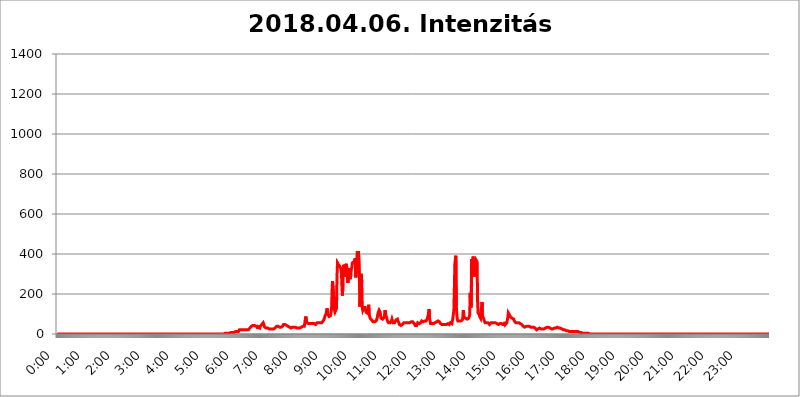
| Category | 2018.04.06. Intenzitás [W/m^2] |
|---|---|
| 0.0 | 0 |
| 0.0006944444444444445 | 0 |
| 0.001388888888888889 | 0 |
| 0.0020833333333333333 | 0 |
| 0.002777777777777778 | 0 |
| 0.003472222222222222 | 0 |
| 0.004166666666666667 | 0 |
| 0.004861111111111111 | 0 |
| 0.005555555555555556 | 0 |
| 0.0062499999999999995 | 0 |
| 0.006944444444444444 | 0 |
| 0.007638888888888889 | 0 |
| 0.008333333333333333 | 0 |
| 0.009027777777777779 | 0 |
| 0.009722222222222222 | 0 |
| 0.010416666666666666 | 0 |
| 0.011111111111111112 | 0 |
| 0.011805555555555555 | 0 |
| 0.012499999999999999 | 0 |
| 0.013194444444444444 | 0 |
| 0.013888888888888888 | 0 |
| 0.014583333333333332 | 0 |
| 0.015277777777777777 | 0 |
| 0.015972222222222224 | 0 |
| 0.016666666666666666 | 0 |
| 0.017361111111111112 | 0 |
| 0.018055555555555557 | 0 |
| 0.01875 | 0 |
| 0.019444444444444445 | 0 |
| 0.02013888888888889 | 0 |
| 0.020833333333333332 | 0 |
| 0.02152777777777778 | 0 |
| 0.022222222222222223 | 0 |
| 0.02291666666666667 | 0 |
| 0.02361111111111111 | 0 |
| 0.024305555555555556 | 0 |
| 0.024999999999999998 | 0 |
| 0.025694444444444447 | 0 |
| 0.02638888888888889 | 0 |
| 0.027083333333333334 | 0 |
| 0.027777777777777776 | 0 |
| 0.02847222222222222 | 0 |
| 0.029166666666666664 | 0 |
| 0.029861111111111113 | 0 |
| 0.030555555555555555 | 0 |
| 0.03125 | 0 |
| 0.03194444444444445 | 0 |
| 0.03263888888888889 | 0 |
| 0.03333333333333333 | 0 |
| 0.034027777777777775 | 0 |
| 0.034722222222222224 | 0 |
| 0.035416666666666666 | 0 |
| 0.036111111111111115 | 0 |
| 0.03680555555555556 | 0 |
| 0.0375 | 0 |
| 0.03819444444444444 | 0 |
| 0.03888888888888889 | 0 |
| 0.03958333333333333 | 0 |
| 0.04027777777777778 | 0 |
| 0.04097222222222222 | 0 |
| 0.041666666666666664 | 0 |
| 0.042361111111111106 | 0 |
| 0.04305555555555556 | 0 |
| 0.043750000000000004 | 0 |
| 0.044444444444444446 | 0 |
| 0.04513888888888889 | 0 |
| 0.04583333333333334 | 0 |
| 0.04652777777777778 | 0 |
| 0.04722222222222222 | 0 |
| 0.04791666666666666 | 0 |
| 0.04861111111111111 | 0 |
| 0.049305555555555554 | 0 |
| 0.049999999999999996 | 0 |
| 0.05069444444444445 | 0 |
| 0.051388888888888894 | 0 |
| 0.052083333333333336 | 0 |
| 0.05277777777777778 | 0 |
| 0.05347222222222222 | 0 |
| 0.05416666666666667 | 0 |
| 0.05486111111111111 | 0 |
| 0.05555555555555555 | 0 |
| 0.05625 | 0 |
| 0.05694444444444444 | 0 |
| 0.057638888888888885 | 0 |
| 0.05833333333333333 | 0 |
| 0.05902777777777778 | 0 |
| 0.059722222222222225 | 0 |
| 0.06041666666666667 | 0 |
| 0.061111111111111116 | 0 |
| 0.06180555555555556 | 0 |
| 0.0625 | 0 |
| 0.06319444444444444 | 0 |
| 0.06388888888888888 | 0 |
| 0.06458333333333334 | 0 |
| 0.06527777777777778 | 0 |
| 0.06597222222222222 | 0 |
| 0.06666666666666667 | 0 |
| 0.06736111111111111 | 0 |
| 0.06805555555555555 | 0 |
| 0.06874999999999999 | 0 |
| 0.06944444444444443 | 0 |
| 0.07013888888888889 | 0 |
| 0.07083333333333333 | 0 |
| 0.07152777777777779 | 0 |
| 0.07222222222222223 | 0 |
| 0.07291666666666667 | 0 |
| 0.07361111111111111 | 0 |
| 0.07430555555555556 | 0 |
| 0.075 | 0 |
| 0.07569444444444444 | 0 |
| 0.0763888888888889 | 0 |
| 0.07708333333333334 | 0 |
| 0.07777777777777778 | 0 |
| 0.07847222222222222 | 0 |
| 0.07916666666666666 | 0 |
| 0.0798611111111111 | 0 |
| 0.08055555555555556 | 0 |
| 0.08125 | 0 |
| 0.08194444444444444 | 0 |
| 0.08263888888888889 | 0 |
| 0.08333333333333333 | 0 |
| 0.08402777777777777 | 0 |
| 0.08472222222222221 | 0 |
| 0.08541666666666665 | 0 |
| 0.08611111111111112 | 0 |
| 0.08680555555555557 | 0 |
| 0.08750000000000001 | 0 |
| 0.08819444444444445 | 0 |
| 0.08888888888888889 | 0 |
| 0.08958333333333333 | 0 |
| 0.09027777777777778 | 0 |
| 0.09097222222222222 | 0 |
| 0.09166666666666667 | 0 |
| 0.09236111111111112 | 0 |
| 0.09305555555555556 | 0 |
| 0.09375 | 0 |
| 0.09444444444444444 | 0 |
| 0.09513888888888888 | 0 |
| 0.09583333333333333 | 0 |
| 0.09652777777777777 | 0 |
| 0.09722222222222222 | 0 |
| 0.09791666666666667 | 0 |
| 0.09861111111111111 | 0 |
| 0.09930555555555555 | 0 |
| 0.09999999999999999 | 0 |
| 0.10069444444444443 | 0 |
| 0.1013888888888889 | 0 |
| 0.10208333333333335 | 0 |
| 0.10277777777777779 | 0 |
| 0.10347222222222223 | 0 |
| 0.10416666666666667 | 0 |
| 0.10486111111111111 | 0 |
| 0.10555555555555556 | 0 |
| 0.10625 | 0 |
| 0.10694444444444444 | 0 |
| 0.1076388888888889 | 0 |
| 0.10833333333333334 | 0 |
| 0.10902777777777778 | 0 |
| 0.10972222222222222 | 0 |
| 0.1111111111111111 | 0 |
| 0.11180555555555556 | 0 |
| 0.11180555555555556 | 0 |
| 0.1125 | 0 |
| 0.11319444444444444 | 0 |
| 0.11388888888888889 | 0 |
| 0.11458333333333333 | 0 |
| 0.11527777777777777 | 0 |
| 0.11597222222222221 | 0 |
| 0.11666666666666665 | 0 |
| 0.1173611111111111 | 0 |
| 0.11805555555555557 | 0 |
| 0.11944444444444445 | 0 |
| 0.12013888888888889 | 0 |
| 0.12083333333333333 | 0 |
| 0.12152777777777778 | 0 |
| 0.12222222222222223 | 0 |
| 0.12291666666666667 | 0 |
| 0.12291666666666667 | 0 |
| 0.12361111111111112 | 0 |
| 0.12430555555555556 | 0 |
| 0.125 | 0 |
| 0.12569444444444444 | 0 |
| 0.12638888888888888 | 0 |
| 0.12708333333333333 | 0 |
| 0.16875 | 0 |
| 0.12847222222222224 | 0 |
| 0.12916666666666668 | 0 |
| 0.12986111111111112 | 0 |
| 0.13055555555555556 | 0 |
| 0.13125 | 0 |
| 0.13194444444444445 | 0 |
| 0.1326388888888889 | 0 |
| 0.13333333333333333 | 0 |
| 0.13402777777777777 | 0 |
| 0.13402777777777777 | 0 |
| 0.13472222222222222 | 0 |
| 0.13541666666666666 | 0 |
| 0.1361111111111111 | 0 |
| 0.13749999999999998 | 0 |
| 0.13819444444444443 | 0 |
| 0.1388888888888889 | 0 |
| 0.13958333333333334 | 0 |
| 0.14027777777777778 | 0 |
| 0.14097222222222222 | 0 |
| 0.14166666666666666 | 0 |
| 0.1423611111111111 | 0 |
| 0.14305555555555557 | 0 |
| 0.14375000000000002 | 0 |
| 0.14444444444444446 | 0 |
| 0.1451388888888889 | 0 |
| 0.1451388888888889 | 0 |
| 0.14652777777777778 | 0 |
| 0.14722222222222223 | 0 |
| 0.14791666666666667 | 0 |
| 0.1486111111111111 | 0 |
| 0.14930555555555555 | 0 |
| 0.15 | 0 |
| 0.15069444444444444 | 0 |
| 0.15138888888888888 | 0 |
| 0.15208333333333332 | 0 |
| 0.15277777777777776 | 0 |
| 0.15347222222222223 | 0 |
| 0.15416666666666667 | 0 |
| 0.15486111111111112 | 0 |
| 0.15555555555555556 | 0 |
| 0.15625 | 0 |
| 0.15694444444444444 | 0 |
| 0.15763888888888888 | 0 |
| 0.15833333333333333 | 0 |
| 0.15902777777777777 | 0 |
| 0.15972222222222224 | 0 |
| 0.16041666666666668 | 0 |
| 0.16111111111111112 | 0 |
| 0.16180555555555556 | 0 |
| 0.1625 | 0 |
| 0.16319444444444445 | 0 |
| 0.1638888888888889 | 0 |
| 0.16458333333333333 | 0 |
| 0.16527777777777777 | 0 |
| 0.16597222222222222 | 0 |
| 0.16666666666666666 | 0 |
| 0.1673611111111111 | 0 |
| 0.16805555555555554 | 0 |
| 0.16874999999999998 | 0 |
| 0.16944444444444443 | 0 |
| 0.17013888888888887 | 0 |
| 0.1708333333333333 | 0 |
| 0.17152777777777775 | 0 |
| 0.17222222222222225 | 0 |
| 0.1729166666666667 | 0 |
| 0.17361111111111113 | 0 |
| 0.17430555555555557 | 0 |
| 0.17500000000000002 | 0 |
| 0.17569444444444446 | 0 |
| 0.1763888888888889 | 0 |
| 0.17708333333333334 | 0 |
| 0.17777777777777778 | 0 |
| 0.17847222222222223 | 0 |
| 0.17916666666666667 | 0 |
| 0.1798611111111111 | 0 |
| 0.18055555555555555 | 0 |
| 0.18125 | 0 |
| 0.18194444444444444 | 0 |
| 0.1826388888888889 | 0 |
| 0.18333333333333335 | 0 |
| 0.1840277777777778 | 0 |
| 0.18472222222222223 | 0 |
| 0.18541666666666667 | 0 |
| 0.18611111111111112 | 0 |
| 0.18680555555555556 | 0 |
| 0.1875 | 0 |
| 0.18819444444444444 | 0 |
| 0.18888888888888888 | 0 |
| 0.18958333333333333 | 0 |
| 0.19027777777777777 | 0 |
| 0.1909722222222222 | 0 |
| 0.19166666666666665 | 0 |
| 0.19236111111111112 | 0 |
| 0.19305555555555554 | 0 |
| 0.19375 | 0 |
| 0.19444444444444445 | 0 |
| 0.1951388888888889 | 0 |
| 0.19583333333333333 | 0 |
| 0.19652777777777777 | 0 |
| 0.19722222222222222 | 0 |
| 0.19791666666666666 | 0 |
| 0.1986111111111111 | 0 |
| 0.19930555555555554 | 0 |
| 0.19999999999999998 | 0 |
| 0.20069444444444443 | 0 |
| 0.20138888888888887 | 0 |
| 0.2020833333333333 | 0 |
| 0.2027777777777778 | 0 |
| 0.2034722222222222 | 0 |
| 0.2041666666666667 | 0 |
| 0.20486111111111113 | 0 |
| 0.20555555555555557 | 0 |
| 0.20625000000000002 | 0 |
| 0.20694444444444446 | 0 |
| 0.2076388888888889 | 0 |
| 0.20833333333333334 | 0 |
| 0.20902777777777778 | 0 |
| 0.20972222222222223 | 0 |
| 0.21041666666666667 | 0 |
| 0.2111111111111111 | 0 |
| 0.21180555555555555 | 0 |
| 0.2125 | 0 |
| 0.21319444444444444 | 0 |
| 0.2138888888888889 | 0 |
| 0.21458333333333335 | 0 |
| 0.2152777777777778 | 0 |
| 0.21597222222222223 | 0 |
| 0.21666666666666667 | 0 |
| 0.21736111111111112 | 0 |
| 0.21805555555555556 | 0 |
| 0.21875 | 0 |
| 0.21944444444444444 | 0 |
| 0.22013888888888888 | 0 |
| 0.22083333333333333 | 0 |
| 0.22152777777777777 | 0 |
| 0.2222222222222222 | 0 |
| 0.22291666666666665 | 0 |
| 0.2236111111111111 | 0 |
| 0.22430555555555556 | 0 |
| 0.225 | 0 |
| 0.22569444444444445 | 0 |
| 0.2263888888888889 | 0 |
| 0.22708333333333333 | 0 |
| 0.22777777777777777 | 0 |
| 0.22847222222222222 | 0 |
| 0.22916666666666666 | 0 |
| 0.2298611111111111 | 0 |
| 0.23055555555555554 | 0 |
| 0.23124999999999998 | 0 |
| 0.23194444444444443 | 0 |
| 0.23263888888888887 | 3.525 |
| 0.2333333333333333 | 0 |
| 0.2340277777777778 | 3.525 |
| 0.2347222222222222 | 3.525 |
| 0.2354166666666667 | 3.525 |
| 0.23611111111111113 | 3.525 |
| 0.23680555555555557 | 3.525 |
| 0.23750000000000002 | 3.525 |
| 0.23819444444444446 | 3.525 |
| 0.2388888888888889 | 3.525 |
| 0.23958333333333334 | 3.525 |
| 0.24027777777777778 | 3.525 |
| 0.24097222222222223 | 3.525 |
| 0.24166666666666667 | 3.525 |
| 0.2423611111111111 | 3.525 |
| 0.24305555555555555 | 7.887 |
| 0.24375 | 7.887 |
| 0.24444444444444446 | 7.887 |
| 0.24513888888888888 | 7.887 |
| 0.24583333333333335 | 7.887 |
| 0.2465277777777778 | 7.887 |
| 0.24722222222222223 | 12.257 |
| 0.24791666666666667 | 7.887 |
| 0.24861111111111112 | 7.887 |
| 0.24930555555555556 | 7.887 |
| 0.25 | 12.257 |
| 0.25069444444444444 | 12.257 |
| 0.2513888888888889 | 12.257 |
| 0.2520833333333333 | 12.257 |
| 0.25277777777777777 | 12.257 |
| 0.2534722222222222 | 12.257 |
| 0.25416666666666665 | 12.257 |
| 0.2548611111111111 | 16.636 |
| 0.2555555555555556 | 21.024 |
| 0.25625000000000003 | 21.024 |
| 0.2569444444444445 | 21.024 |
| 0.2576388888888889 | 21.024 |
| 0.25833333333333336 | 21.024 |
| 0.2590277777777778 | 21.024 |
| 0.25972222222222224 | 21.024 |
| 0.2604166666666667 | 21.024 |
| 0.2611111111111111 | 21.024 |
| 0.26180555555555557 | 21.024 |
| 0.2625 | 21.024 |
| 0.26319444444444445 | 21.024 |
| 0.2638888888888889 | 21.024 |
| 0.26458333333333334 | 21.024 |
| 0.2652777777777778 | 16.636 |
| 0.2659722222222222 | 21.024 |
| 0.26666666666666666 | 21.024 |
| 0.2673611111111111 | 21.024 |
| 0.26805555555555555 | 21.024 |
| 0.26875 | 25.419 |
| 0.26944444444444443 | 25.419 |
| 0.2701388888888889 | 29.823 |
| 0.2708333333333333 | 29.823 |
| 0.27152777777777776 | 34.234 |
| 0.2722222222222222 | 38.653 |
| 0.27291666666666664 | 38.653 |
| 0.2736111111111111 | 38.653 |
| 0.2743055555555555 | 43.079 |
| 0.27499999999999997 | 38.653 |
| 0.27569444444444446 | 38.653 |
| 0.27638888888888885 | 43.079 |
| 0.27708333333333335 | 43.079 |
| 0.2777777777777778 | 43.079 |
| 0.27847222222222223 | 38.653 |
| 0.2791666666666667 | 38.653 |
| 0.2798611111111111 | 38.653 |
| 0.28055555555555556 | 38.653 |
| 0.28125 | 25.419 |
| 0.28194444444444444 | 34.234 |
| 0.2826388888888889 | 34.234 |
| 0.2833333333333333 | 29.823 |
| 0.28402777777777777 | 29.823 |
| 0.2847222222222222 | 38.653 |
| 0.28541666666666665 | 43.079 |
| 0.28611111111111115 | 43.079 |
| 0.28680555555555554 | 47.511 |
| 0.28750000000000003 | 51.951 |
| 0.2881944444444445 | 51.951 |
| 0.2888888888888889 | 56.398 |
| 0.28958333333333336 | 56.398 |
| 0.2902777777777778 | 56.398 |
| 0.29097222222222224 | 34.234 |
| 0.2916666666666667 | 29.823 |
| 0.2923611111111111 | 29.823 |
| 0.29305555555555557 | 29.823 |
| 0.29375 | 29.823 |
| 0.29444444444444445 | 29.823 |
| 0.2951388888888889 | 29.823 |
| 0.29583333333333334 | 25.419 |
| 0.2965277777777778 | 25.419 |
| 0.2972222222222222 | 25.419 |
| 0.29791666666666666 | 25.419 |
| 0.2986111111111111 | 25.419 |
| 0.29930555555555555 | 25.419 |
| 0.3 | 21.024 |
| 0.30069444444444443 | 21.024 |
| 0.3013888888888889 | 25.419 |
| 0.3020833333333333 | 25.419 |
| 0.30277777777777776 | 29.823 |
| 0.3034722222222222 | 25.419 |
| 0.30416666666666664 | 25.419 |
| 0.3048611111111111 | 29.823 |
| 0.3055555555555555 | 29.823 |
| 0.30624999999999997 | 34.234 |
| 0.3069444444444444 | 34.234 |
| 0.3076388888888889 | 38.653 |
| 0.30833333333333335 | 38.653 |
| 0.3090277777777778 | 38.653 |
| 0.30972222222222223 | 38.653 |
| 0.3104166666666667 | 38.653 |
| 0.3111111111111111 | 34.234 |
| 0.31180555555555556 | 34.234 |
| 0.3125 | 34.234 |
| 0.31319444444444444 | 34.234 |
| 0.3138888888888889 | 34.234 |
| 0.3145833333333333 | 34.234 |
| 0.31527777777777777 | 38.653 |
| 0.3159722222222222 | 38.653 |
| 0.31666666666666665 | 43.079 |
| 0.31736111111111115 | 47.511 |
| 0.31805555555555554 | 47.511 |
| 0.31875000000000003 | 47.511 |
| 0.3194444444444445 | 47.511 |
| 0.3201388888888889 | 47.511 |
| 0.32083333333333336 | 43.079 |
| 0.3215277777777778 | 43.079 |
| 0.32222222222222224 | 43.079 |
| 0.3229166666666667 | 38.653 |
| 0.3236111111111111 | 38.653 |
| 0.32430555555555557 | 38.653 |
| 0.325 | 38.653 |
| 0.32569444444444445 | 34.234 |
| 0.3263888888888889 | 34.234 |
| 0.32708333333333334 | 34.234 |
| 0.3277777777777778 | 29.823 |
| 0.3284722222222222 | 34.234 |
| 0.32916666666666666 | 29.823 |
| 0.3298611111111111 | 34.234 |
| 0.33055555555555555 | 34.234 |
| 0.33125 | 34.234 |
| 0.33194444444444443 | 34.234 |
| 0.3326388888888889 | 34.234 |
| 0.3333333333333333 | 34.234 |
| 0.3340277777777778 | 34.234 |
| 0.3347222222222222 | 34.234 |
| 0.3354166666666667 | 29.823 |
| 0.3361111111111111 | 29.823 |
| 0.3368055555555556 | 29.823 |
| 0.33749999999999997 | 29.823 |
| 0.33819444444444446 | 29.823 |
| 0.33888888888888885 | 29.823 |
| 0.33958333333333335 | 29.823 |
| 0.34027777777777773 | 29.823 |
| 0.34097222222222223 | 34.234 |
| 0.3416666666666666 | 34.234 |
| 0.3423611111111111 | 34.234 |
| 0.3430555555555555 | 34.234 |
| 0.34375 | 34.234 |
| 0.3444444444444445 | 38.653 |
| 0.3451388888888889 | 38.653 |
| 0.3458333333333334 | 38.653 |
| 0.34652777777777777 | 38.653 |
| 0.34722222222222227 | 43.079 |
| 0.34791666666666665 | 74.246 |
| 0.34861111111111115 | 87.692 |
| 0.34930555555555554 | 83.205 |
| 0.35000000000000003 | 56.398 |
| 0.3506944444444444 | 56.398 |
| 0.3513888888888889 | 51.951 |
| 0.3520833333333333 | 51.951 |
| 0.3527777777777778 | 51.951 |
| 0.3534722222222222 | 51.951 |
| 0.3541666666666667 | 51.951 |
| 0.3548611111111111 | 51.951 |
| 0.35555555555555557 | 51.951 |
| 0.35625 | 51.951 |
| 0.35694444444444445 | 56.398 |
| 0.3576388888888889 | 51.951 |
| 0.35833333333333334 | 51.951 |
| 0.3590277777777778 | 51.951 |
| 0.3597222222222222 | 51.951 |
| 0.36041666666666666 | 51.951 |
| 0.3611111111111111 | 47.511 |
| 0.36180555555555555 | 47.511 |
| 0.3625 | 47.511 |
| 0.36319444444444443 | 47.511 |
| 0.3638888888888889 | 51.951 |
| 0.3645833333333333 | 56.398 |
| 0.3652777777777778 | 56.398 |
| 0.3659722222222222 | 56.398 |
| 0.3666666666666667 | 56.398 |
| 0.3673611111111111 | 56.398 |
| 0.3680555555555556 | 56.398 |
| 0.36874999999999997 | 56.398 |
| 0.36944444444444446 | 56.398 |
| 0.37013888888888885 | 56.398 |
| 0.37083333333333335 | 56.398 |
| 0.37152777777777773 | 56.398 |
| 0.37222222222222223 | 60.85 |
| 0.3729166666666666 | 65.31 |
| 0.3736111111111111 | 69.775 |
| 0.3743055555555555 | 74.246 |
| 0.375 | 83.205 |
| 0.3756944444444445 | 92.184 |
| 0.3763888888888889 | 96.682 |
| 0.3770833333333334 | 101.184 |
| 0.37777777777777777 | 105.69 |
| 0.37847222222222227 | 128.284 |
| 0.37916666666666665 | 101.184 |
| 0.37986111111111115 | 96.682 |
| 0.38055555555555554 | 96.682 |
| 0.38125000000000003 | 87.692 |
| 0.3819444444444444 | 87.692 |
| 0.3826388888888889 | 87.692 |
| 0.3833333333333333 | 92.184 |
| 0.3840277777777778 | 110.201 |
| 0.3847222222222222 | 123.758 |
| 0.3854166666666667 | 214.746 |
| 0.3861111111111111 | 264.932 |
| 0.38680555555555557 | 269.49 |
| 0.3875 | 191.937 |
| 0.38819444444444445 | 169.156 |
| 0.3888888888888889 | 119.235 |
| 0.38958333333333334 | 110.201 |
| 0.3902777777777778 | 110.201 |
| 0.3909722222222222 | 110.201 |
| 0.39166666666666666 | 128.284 |
| 0.3923611111111111 | 287.709 |
| 0.39305555555555555 | 355.712 |
| 0.39375 | 351.198 |
| 0.39444444444444443 | 346.682 |
| 0.3951388888888889 | 346.682 |
| 0.3958333333333333 | 342.162 |
| 0.3965277777777778 | 337.639 |
| 0.3972222222222222 | 337.639 |
| 0.3979166666666667 | 324.052 |
| 0.3986111111111111 | 305.898 |
| 0.3993055555555556 | 228.436 |
| 0.39999999999999997 | 191.937 |
| 0.40069444444444446 | 251.251 |
| 0.40138888888888885 | 346.682 |
| 0.40208333333333335 | 337.639 |
| 0.40277777777777773 | 287.709 |
| 0.40347222222222223 | 296.808 |
| 0.4041666666666666 | 337.639 |
| 0.4048611111111111 | 342.162 |
| 0.4055555555555555 | 351.198 |
| 0.40625 | 351.198 |
| 0.4069444444444445 | 351.198 |
| 0.4076388888888889 | 255.813 |
| 0.4083333333333334 | 260.373 |
| 0.40902777777777777 | 296.808 |
| 0.40972222222222227 | 328.584 |
| 0.41041666666666665 | 301.354 |
| 0.41111111111111115 | 274.047 |
| 0.41180555555555554 | 301.354 |
| 0.41250000000000003 | 324.052 |
| 0.4131944444444444 | 333.113 |
| 0.4138888888888889 | 355.712 |
| 0.4145833333333333 | 355.712 |
| 0.4152777777777778 | 360.221 |
| 0.4159722222222222 | 360.221 |
| 0.4166666666666667 | 360.221 |
| 0.4173611111111111 | 364.728 |
| 0.41805555555555557 | 378.224 |
| 0.41875 | 283.156 |
| 0.41944444444444445 | 314.98 |
| 0.4201388888888889 | 314.98 |
| 0.42083333333333334 | 414.035 |
| 0.4215277777777778 | 405.108 |
| 0.4222222222222222 | 414.035 |
| 0.42291666666666666 | 387.202 |
| 0.4236111111111111 | 342.162 |
| 0.42430555555555555 | 137.347 |
| 0.425 | 173.709 |
| 0.42569444444444443 | 182.82 |
| 0.4263888888888889 | 301.354 |
| 0.4270833333333333 | 260.373 |
| 0.4277777777777778 | 132.814 |
| 0.4284722222222222 | 119.235 |
| 0.4291666666666667 | 119.235 |
| 0.4298611111111111 | 132.814 |
| 0.4305555555555556 | 137.347 |
| 0.43124999999999997 | 128.284 |
| 0.43194444444444446 | 132.814 |
| 0.43263888888888885 | 114.716 |
| 0.43333333333333335 | 110.201 |
| 0.43402777777777773 | 105.69 |
| 0.43472222222222223 | 105.69 |
| 0.4354166666666666 | 101.184 |
| 0.4361111111111111 | 101.184 |
| 0.4368055555555555 | 146.423 |
| 0.4375 | 101.184 |
| 0.4381944444444445 | 87.692 |
| 0.4388888888888889 | 78.722 |
| 0.4395833333333334 | 74.246 |
| 0.44027777777777777 | 74.246 |
| 0.44097222222222227 | 69.775 |
| 0.44166666666666665 | 65.31 |
| 0.44236111111111115 | 65.31 |
| 0.44305555555555554 | 60.85 |
| 0.44375000000000003 | 60.85 |
| 0.4444444444444444 | 60.85 |
| 0.4451388888888889 | 60.85 |
| 0.4458333333333333 | 60.85 |
| 0.4465277777777778 | 65.31 |
| 0.4472222222222222 | 65.31 |
| 0.4479166666666667 | 69.775 |
| 0.4486111111111111 | 78.722 |
| 0.44930555555555557 | 92.184 |
| 0.45 | 105.69 |
| 0.45069444444444445 | 110.201 |
| 0.4513888888888889 | 119.235 |
| 0.45208333333333334 | 123.758 |
| 0.4527777777777778 | 110.201 |
| 0.4534722222222222 | 92.184 |
| 0.45416666666666666 | 78.722 |
| 0.4548611111111111 | 74.246 |
| 0.45555555555555555 | 74.246 |
| 0.45625 | 74.246 |
| 0.45694444444444443 | 74.246 |
| 0.4576388888888889 | 78.722 |
| 0.4583333333333333 | 83.205 |
| 0.4590277777777778 | 92.184 |
| 0.4597222222222222 | 119.235 |
| 0.4604166666666667 | 105.69 |
| 0.4611111111111111 | 92.184 |
| 0.4618055555555556 | 83.205 |
| 0.46249999999999997 | 74.246 |
| 0.46319444444444446 | 65.31 |
| 0.46388888888888885 | 60.85 |
| 0.46458333333333335 | 56.398 |
| 0.46527777777777773 | 56.398 |
| 0.46597222222222223 | 56.398 |
| 0.4666666666666666 | 56.398 |
| 0.4673611111111111 | 60.85 |
| 0.4680555555555555 | 60.85 |
| 0.46875 | 65.31 |
| 0.4694444444444445 | 74.246 |
| 0.4701388888888889 | 65.31 |
| 0.4708333333333334 | 56.398 |
| 0.47152777777777777 | 56.398 |
| 0.47222222222222227 | 56.398 |
| 0.47291666666666665 | 56.398 |
| 0.47361111111111115 | 56.398 |
| 0.47430555555555554 | 60.85 |
| 0.47500000000000003 | 69.775 |
| 0.4756944444444444 | 74.246 |
| 0.4763888888888889 | 74.246 |
| 0.4770833333333333 | 74.246 |
| 0.4777777777777778 | 65.31 |
| 0.4784722222222222 | 60.85 |
| 0.4791666666666667 | 56.398 |
| 0.4798611111111111 | 47.511 |
| 0.48055555555555557 | 47.511 |
| 0.48125 | 43.079 |
| 0.48194444444444445 | 43.079 |
| 0.4826388888888889 | 47.511 |
| 0.48333333333333334 | 47.511 |
| 0.4840277777777778 | 47.511 |
| 0.4847222222222222 | 51.951 |
| 0.48541666666666666 | 51.951 |
| 0.4861111111111111 | 56.398 |
| 0.48680555555555555 | 56.398 |
| 0.4875 | 56.398 |
| 0.48819444444444443 | 56.398 |
| 0.4888888888888889 | 56.398 |
| 0.4895833333333333 | 56.398 |
| 0.4902777777777778 | 56.398 |
| 0.4909722222222222 | 56.398 |
| 0.4916666666666667 | 51.951 |
| 0.4923611111111111 | 56.398 |
| 0.4930555555555556 | 56.398 |
| 0.49374999999999997 | 56.398 |
| 0.49444444444444446 | 56.398 |
| 0.49513888888888885 | 56.398 |
| 0.49583333333333335 | 60.85 |
| 0.49652777777777773 | 60.85 |
| 0.49722222222222223 | 65.31 |
| 0.4979166666666666 | 65.31 |
| 0.4986111111111111 | 60.85 |
| 0.4993055555555555 | 56.398 |
| 0.5 | 56.398 |
| 0.5006944444444444 | 51.951 |
| 0.5013888888888889 | 47.511 |
| 0.5020833333333333 | 43.079 |
| 0.5027777777777778 | 43.079 |
| 0.5034722222222222 | 43.079 |
| 0.5041666666666667 | 43.079 |
| 0.5048611111111111 | 47.511 |
| 0.5055555555555555 | 56.398 |
| 0.50625 | 56.398 |
| 0.5069444444444444 | 56.398 |
| 0.5076388888888889 | 51.951 |
| 0.5083333333333333 | 56.398 |
| 0.5090277777777777 | 56.398 |
| 0.5097222222222222 | 56.398 |
| 0.5104166666666666 | 60.85 |
| 0.5111111111111112 | 65.31 |
| 0.5118055555555555 | 65.31 |
| 0.5125000000000001 | 60.85 |
| 0.5131944444444444 | 60.85 |
| 0.513888888888889 | 60.85 |
| 0.5145833333333333 | 60.85 |
| 0.5152777777777778 | 65.31 |
| 0.5159722222222222 | 65.31 |
| 0.5166666666666667 | 69.775 |
| 0.517361111111111 | 65.31 |
| 0.5180555555555556 | 69.775 |
| 0.5187499999999999 | 74.246 |
| 0.5194444444444445 | 83.205 |
| 0.5201388888888888 | 92.184 |
| 0.5208333333333334 | 96.682 |
| 0.5215277777777778 | 123.758 |
| 0.5222222222222223 | 78.722 |
| 0.5229166666666667 | 65.31 |
| 0.5236111111111111 | 51.951 |
| 0.5243055555555556 | 51.951 |
| 0.525 | 51.951 |
| 0.5256944444444445 | 51.951 |
| 0.5263888888888889 | 51.951 |
| 0.5270833333333333 | 51.951 |
| 0.5277777777777778 | 51.951 |
| 0.5284722222222222 | 51.951 |
| 0.5291666666666667 | 56.398 |
| 0.5298611111111111 | 56.398 |
| 0.5305555555555556 | 56.398 |
| 0.53125 | 60.85 |
| 0.5319444444444444 | 60.85 |
| 0.5326388888888889 | 60.85 |
| 0.5333333333333333 | 60.85 |
| 0.5340277777777778 | 65.31 |
| 0.5347222222222222 | 65.31 |
| 0.5354166666666667 | 65.31 |
| 0.5361111111111111 | 60.85 |
| 0.5368055555555555 | 56.398 |
| 0.5375 | 51.951 |
| 0.5381944444444444 | 51.951 |
| 0.5388888888888889 | 47.511 |
| 0.5395833333333333 | 47.511 |
| 0.5402777777777777 | 47.511 |
| 0.5409722222222222 | 47.511 |
| 0.5416666666666666 | 47.511 |
| 0.5423611111111112 | 47.511 |
| 0.5430555555555555 | 47.511 |
| 0.5437500000000001 | 47.511 |
| 0.5444444444444444 | 47.511 |
| 0.545138888888889 | 47.511 |
| 0.5458333333333333 | 47.511 |
| 0.5465277777777778 | 47.511 |
| 0.5472222222222222 | 47.511 |
| 0.5479166666666667 | 51.951 |
| 0.548611111111111 | 51.951 |
| 0.5493055555555556 | 47.511 |
| 0.5499999999999999 | 47.511 |
| 0.5506944444444445 | 51.951 |
| 0.5513888888888888 | 56.398 |
| 0.5520833333333334 | 56.398 |
| 0.5527777777777778 | 51.951 |
| 0.5534722222222223 | 51.951 |
| 0.5541666666666667 | 51.951 |
| 0.5548611111111111 | 78.722 |
| 0.5555555555555556 | 83.205 |
| 0.55625 | 119.235 |
| 0.5569444444444445 | 223.873 |
| 0.5576388888888889 | 351.198 |
| 0.5583333333333333 | 346.682 |
| 0.5590277777777778 | 391.685 |
| 0.5597222222222222 | 132.814 |
| 0.5604166666666667 | 101.184 |
| 0.5611111111111111 | 74.246 |
| 0.5618055555555556 | 65.31 |
| 0.5625 | 65.31 |
| 0.5631944444444444 | 60.85 |
| 0.5638888888888889 | 65.31 |
| 0.5645833333333333 | 65.31 |
| 0.5652777777777778 | 65.31 |
| 0.5659722222222222 | 65.31 |
| 0.5666666666666667 | 60.85 |
| 0.5673611111111111 | 60.85 |
| 0.5680555555555555 | 69.775 |
| 0.56875 | 78.722 |
| 0.5694444444444444 | 119.235 |
| 0.5701388888888889 | 101.184 |
| 0.5708333333333333 | 83.205 |
| 0.5715277777777777 | 87.692 |
| 0.5722222222222222 | 83.205 |
| 0.5729166666666666 | 78.722 |
| 0.5736111111111112 | 74.246 |
| 0.5743055555555555 | 74.246 |
| 0.5750000000000001 | 74.246 |
| 0.5756944444444444 | 74.246 |
| 0.576388888888889 | 74.246 |
| 0.5770833333333333 | 78.722 |
| 0.5777777777777778 | 83.205 |
| 0.5784722222222222 | 96.682 |
| 0.5791666666666667 | 205.62 |
| 0.579861111111111 | 146.423 |
| 0.5805555555555556 | 132.814 |
| 0.5812499999999999 | 373.729 |
| 0.5819444444444445 | 378.224 |
| 0.5826388888888888 | 364.728 |
| 0.5833333333333334 | 387.202 |
| 0.5840277777777778 | 382.715 |
| 0.5847222222222223 | 287.709 |
| 0.5854166666666667 | 287.709 |
| 0.5861111111111111 | 292.259 |
| 0.5868055555555556 | 351.198 |
| 0.5875 | 369.23 |
| 0.5881944444444445 | 369.23 |
| 0.5888888888888889 | 360.221 |
| 0.5895833333333333 | 160.056 |
| 0.5902777777777778 | 105.69 |
| 0.5909722222222222 | 101.184 |
| 0.5916666666666667 | 96.682 |
| 0.5923611111111111 | 87.692 |
| 0.5930555555555556 | 87.692 |
| 0.59375 | 78.722 |
| 0.5944444444444444 | 74.246 |
| 0.5951388888888889 | 78.722 |
| 0.5958333333333333 | 160.056 |
| 0.5965277777777778 | 87.692 |
| 0.5972222222222222 | 83.205 |
| 0.5979166666666667 | 78.722 |
| 0.5986111111111111 | 69.775 |
| 0.5993055555555555 | 65.31 |
| 0.6 | 56.398 |
| 0.6006944444444444 | 56.398 |
| 0.6013888888888889 | 56.398 |
| 0.6020833333333333 | 56.398 |
| 0.6027777777777777 | 56.398 |
| 0.6034722222222222 | 56.398 |
| 0.6041666666666666 | 56.398 |
| 0.6048611111111112 | 51.951 |
| 0.6055555555555555 | 51.951 |
| 0.6062500000000001 | 47.511 |
| 0.6069444444444444 | 47.511 |
| 0.607638888888889 | 51.951 |
| 0.6083333333333333 | 56.398 |
| 0.6090277777777778 | 56.398 |
| 0.6097222222222222 | 56.398 |
| 0.6104166666666667 | 56.398 |
| 0.611111111111111 | 56.398 |
| 0.6118055555555556 | 56.398 |
| 0.6124999999999999 | 56.398 |
| 0.6131944444444445 | 56.398 |
| 0.6138888888888888 | 56.398 |
| 0.6145833333333334 | 56.398 |
| 0.6152777777777778 | 56.398 |
| 0.6159722222222223 | 51.951 |
| 0.6166666666666667 | 51.951 |
| 0.6173611111111111 | 51.951 |
| 0.6180555555555556 | 51.951 |
| 0.61875 | 47.511 |
| 0.6194444444444445 | 47.511 |
| 0.6201388888888889 | 47.511 |
| 0.6208333333333333 | 51.951 |
| 0.6215277777777778 | 51.951 |
| 0.6222222222222222 | 56.398 |
| 0.6229166666666667 | 51.951 |
| 0.6236111111111111 | 51.951 |
| 0.6243055555555556 | 51.951 |
| 0.625 | 47.511 |
| 0.6256944444444444 | 47.511 |
| 0.6263888888888889 | 47.511 |
| 0.6270833333333333 | 47.511 |
| 0.6277777777777778 | 60.85 |
| 0.6284722222222222 | 47.511 |
| 0.6291666666666667 | 51.951 |
| 0.6298611111111111 | 51.951 |
| 0.6305555555555555 | 56.398 |
| 0.63125 | 56.398 |
| 0.6319444444444444 | 83.205 |
| 0.6326388888888889 | 105.69 |
| 0.6333333333333333 | 101.184 |
| 0.6340277777777777 | 101.184 |
| 0.6347222222222222 | 92.184 |
| 0.6354166666666666 | 87.692 |
| 0.6361111111111112 | 83.205 |
| 0.6368055555555555 | 78.722 |
| 0.6375000000000001 | 83.205 |
| 0.6381944444444444 | 78.722 |
| 0.638888888888889 | 74.246 |
| 0.6395833333333333 | 74.246 |
| 0.6402777777777778 | 74.246 |
| 0.6409722222222222 | 65.31 |
| 0.6416666666666667 | 60.85 |
| 0.642361111111111 | 60.85 |
| 0.6430555555555556 | 56.398 |
| 0.6437499999999999 | 56.398 |
| 0.6444444444444445 | 56.398 |
| 0.6451388888888888 | 56.398 |
| 0.6458333333333334 | 56.398 |
| 0.6465277777777778 | 56.398 |
| 0.6472222222222223 | 56.398 |
| 0.6479166666666667 | 56.398 |
| 0.6486111111111111 | 56.398 |
| 0.6493055555555556 | 51.951 |
| 0.65 | 51.951 |
| 0.6506944444444445 | 51.951 |
| 0.6513888888888889 | 47.511 |
| 0.6520833333333333 | 47.511 |
| 0.6527777777777778 | 43.079 |
| 0.6534722222222222 | 38.653 |
| 0.6541666666666667 | 38.653 |
| 0.6548611111111111 | 38.653 |
| 0.6555555555555556 | 34.234 |
| 0.65625 | 34.234 |
| 0.6569444444444444 | 34.234 |
| 0.6576388888888889 | 38.653 |
| 0.6583333333333333 | 43.079 |
| 0.6590277777777778 | 43.079 |
| 0.6597222222222222 | 38.653 |
| 0.6604166666666667 | 38.653 |
| 0.6611111111111111 | 38.653 |
| 0.6618055555555555 | 38.653 |
| 0.6625 | 38.653 |
| 0.6631944444444444 | 38.653 |
| 0.6638888888888889 | 34.234 |
| 0.6645833333333333 | 34.234 |
| 0.6652777777777777 | 34.234 |
| 0.6659722222222222 | 34.234 |
| 0.6666666666666666 | 34.234 |
| 0.6673611111111111 | 34.234 |
| 0.6680555555555556 | 34.234 |
| 0.6687500000000001 | 29.823 |
| 0.6694444444444444 | 29.823 |
| 0.6701388888888888 | 29.823 |
| 0.6708333333333334 | 29.823 |
| 0.6715277777777778 | 29.823 |
| 0.6722222222222222 | 21.024 |
| 0.6729166666666666 | 25.419 |
| 0.6736111111111112 | 25.419 |
| 0.6743055555555556 | 25.419 |
| 0.6749999999999999 | 29.823 |
| 0.6756944444444444 | 29.823 |
| 0.6763888888888889 | 29.823 |
| 0.6770833333333334 | 29.823 |
| 0.6777777777777777 | 29.823 |
| 0.6784722222222223 | 25.419 |
| 0.6791666666666667 | 25.419 |
| 0.6798611111111111 | 25.419 |
| 0.6805555555555555 | 25.419 |
| 0.68125 | 25.419 |
| 0.6819444444444445 | 25.419 |
| 0.6826388888888889 | 25.419 |
| 0.6833333333333332 | 29.823 |
| 0.6840277777777778 | 29.823 |
| 0.6847222222222222 | 29.823 |
| 0.6854166666666667 | 29.823 |
| 0.686111111111111 | 34.234 |
| 0.6868055555555556 | 34.234 |
| 0.6875 | 34.234 |
| 0.6881944444444444 | 34.234 |
| 0.688888888888889 | 34.234 |
| 0.6895833333333333 | 29.823 |
| 0.6902777777777778 | 29.823 |
| 0.6909722222222222 | 29.823 |
| 0.6916666666666668 | 29.823 |
| 0.6923611111111111 | 29.823 |
| 0.6930555555555555 | 25.419 |
| 0.69375 | 25.419 |
| 0.6944444444444445 | 25.419 |
| 0.6951388888888889 | 25.419 |
| 0.6958333333333333 | 25.419 |
| 0.6965277777777777 | 29.823 |
| 0.6972222222222223 | 29.823 |
| 0.6979166666666666 | 29.823 |
| 0.6986111111111111 | 29.823 |
| 0.6993055555555556 | 29.823 |
| 0.7000000000000001 | 29.823 |
| 0.7006944444444444 | 29.823 |
| 0.7013888888888888 | 34.234 |
| 0.7020833333333334 | 29.823 |
| 0.7027777777777778 | 29.823 |
| 0.7034722222222222 | 29.823 |
| 0.7041666666666666 | 29.823 |
| 0.7048611111111112 | 29.823 |
| 0.7055555555555556 | 29.823 |
| 0.7062499999999999 | 25.419 |
| 0.7069444444444444 | 25.419 |
| 0.7076388888888889 | 25.419 |
| 0.7083333333333334 | 25.419 |
| 0.7090277777777777 | 25.419 |
| 0.7097222222222223 | 21.024 |
| 0.7104166666666667 | 21.024 |
| 0.7111111111111111 | 21.024 |
| 0.7118055555555555 | 21.024 |
| 0.7125 | 16.636 |
| 0.7131944444444445 | 16.636 |
| 0.7138888888888889 | 16.636 |
| 0.7145833333333332 | 16.636 |
| 0.7152777777777778 | 16.636 |
| 0.7159722222222222 | 16.636 |
| 0.7166666666666667 | 16.636 |
| 0.717361111111111 | 16.636 |
| 0.7180555555555556 | 12.257 |
| 0.71875 | 12.257 |
| 0.7194444444444444 | 12.257 |
| 0.720138888888889 | 12.257 |
| 0.7208333333333333 | 12.257 |
| 0.7215277777777778 | 12.257 |
| 0.7222222222222222 | 12.257 |
| 0.7229166666666668 | 12.257 |
| 0.7236111111111111 | 12.257 |
| 0.7243055555555555 | 12.257 |
| 0.725 | 12.257 |
| 0.7256944444444445 | 12.257 |
| 0.7263888888888889 | 12.257 |
| 0.7270833333333333 | 12.257 |
| 0.7277777777777777 | 12.257 |
| 0.7284722222222223 | 12.257 |
| 0.7291666666666666 | 12.257 |
| 0.7298611111111111 | 12.257 |
| 0.7305555555555556 | 12.257 |
| 0.7312500000000001 | 7.887 |
| 0.7319444444444444 | 7.887 |
| 0.7326388888888888 | 7.887 |
| 0.7333333333333334 | 7.887 |
| 0.7340277777777778 | 7.887 |
| 0.7347222222222222 | 7.887 |
| 0.7354166666666666 | 7.887 |
| 0.7361111111111112 | 7.887 |
| 0.7368055555555556 | 3.525 |
| 0.7374999999999999 | 3.525 |
| 0.7381944444444444 | 3.525 |
| 0.7388888888888889 | 3.525 |
| 0.7395833333333334 | 3.525 |
| 0.7402777777777777 | 3.525 |
| 0.7409722222222223 | 3.525 |
| 0.7416666666666667 | 3.525 |
| 0.7423611111111111 | 3.525 |
| 0.7430555555555555 | 3.525 |
| 0.74375 | 3.525 |
| 0.7444444444444445 | 3.525 |
| 0.7451388888888889 | 3.525 |
| 0.7458333333333332 | 0 |
| 0.7465277777777778 | 3.525 |
| 0.7472222222222222 | 0 |
| 0.7479166666666667 | 0 |
| 0.748611111111111 | 0 |
| 0.7493055555555556 | 0 |
| 0.75 | 0 |
| 0.7506944444444444 | 0 |
| 0.751388888888889 | 0 |
| 0.7520833333333333 | 0 |
| 0.7527777777777778 | 0 |
| 0.7534722222222222 | 0 |
| 0.7541666666666668 | 0 |
| 0.7548611111111111 | 0 |
| 0.7555555555555555 | 0 |
| 0.75625 | 0 |
| 0.7569444444444445 | 0 |
| 0.7576388888888889 | 0 |
| 0.7583333333333333 | 0 |
| 0.7590277777777777 | 0 |
| 0.7597222222222223 | 0 |
| 0.7604166666666666 | 0 |
| 0.7611111111111111 | 0 |
| 0.7618055555555556 | 0 |
| 0.7625000000000001 | 0 |
| 0.7631944444444444 | 0 |
| 0.7638888888888888 | 0 |
| 0.7645833333333334 | 0 |
| 0.7652777777777778 | 0 |
| 0.7659722222222222 | 0 |
| 0.7666666666666666 | 0 |
| 0.7673611111111112 | 0 |
| 0.7680555555555556 | 0 |
| 0.7687499999999999 | 0 |
| 0.7694444444444444 | 0 |
| 0.7701388888888889 | 0 |
| 0.7708333333333334 | 0 |
| 0.7715277777777777 | 0 |
| 0.7722222222222223 | 0 |
| 0.7729166666666667 | 0 |
| 0.7736111111111111 | 0 |
| 0.7743055555555555 | 0 |
| 0.775 | 0 |
| 0.7756944444444445 | 0 |
| 0.7763888888888889 | 0 |
| 0.7770833333333332 | 0 |
| 0.7777777777777778 | 0 |
| 0.7784722222222222 | 0 |
| 0.7791666666666667 | 0 |
| 0.779861111111111 | 0 |
| 0.7805555555555556 | 0 |
| 0.78125 | 0 |
| 0.7819444444444444 | 0 |
| 0.782638888888889 | 0 |
| 0.7833333333333333 | 0 |
| 0.7840277777777778 | 0 |
| 0.7847222222222222 | 0 |
| 0.7854166666666668 | 0 |
| 0.7861111111111111 | 0 |
| 0.7868055555555555 | 0 |
| 0.7875 | 0 |
| 0.7881944444444445 | 0 |
| 0.7888888888888889 | 0 |
| 0.7895833333333333 | 0 |
| 0.7902777777777777 | 0 |
| 0.7909722222222223 | 0 |
| 0.7916666666666666 | 0 |
| 0.7923611111111111 | 0 |
| 0.7930555555555556 | 0 |
| 0.7937500000000001 | 0 |
| 0.7944444444444444 | 0 |
| 0.7951388888888888 | 0 |
| 0.7958333333333334 | 0 |
| 0.7965277777777778 | 0 |
| 0.7972222222222222 | 0 |
| 0.7979166666666666 | 0 |
| 0.7986111111111112 | 0 |
| 0.7993055555555556 | 0 |
| 0.7999999999999999 | 0 |
| 0.8006944444444444 | 0 |
| 0.8013888888888889 | 0 |
| 0.8020833333333334 | 0 |
| 0.8027777777777777 | 0 |
| 0.8034722222222223 | 0 |
| 0.8041666666666667 | 0 |
| 0.8048611111111111 | 0 |
| 0.8055555555555555 | 0 |
| 0.80625 | 0 |
| 0.8069444444444445 | 0 |
| 0.8076388888888889 | 0 |
| 0.8083333333333332 | 0 |
| 0.8090277777777778 | 0 |
| 0.8097222222222222 | 0 |
| 0.8104166666666667 | 0 |
| 0.811111111111111 | 0 |
| 0.8118055555555556 | 0 |
| 0.8125 | 0 |
| 0.8131944444444444 | 0 |
| 0.813888888888889 | 0 |
| 0.8145833333333333 | 0 |
| 0.8152777777777778 | 0 |
| 0.8159722222222222 | 0 |
| 0.8166666666666668 | 0 |
| 0.8173611111111111 | 0 |
| 0.8180555555555555 | 0 |
| 0.81875 | 0 |
| 0.8194444444444445 | 0 |
| 0.8201388888888889 | 0 |
| 0.8208333333333333 | 0 |
| 0.8215277777777777 | 0 |
| 0.8222222222222223 | 0 |
| 0.8229166666666666 | 0 |
| 0.8236111111111111 | 0 |
| 0.8243055555555556 | 0 |
| 0.8250000000000001 | 0 |
| 0.8256944444444444 | 0 |
| 0.8263888888888888 | 0 |
| 0.8270833333333334 | 0 |
| 0.8277777777777778 | 0 |
| 0.8284722222222222 | 0 |
| 0.8291666666666666 | 0 |
| 0.8298611111111112 | 0 |
| 0.8305555555555556 | 0 |
| 0.8312499999999999 | 0 |
| 0.8319444444444444 | 0 |
| 0.8326388888888889 | 0 |
| 0.8333333333333334 | 0 |
| 0.8340277777777777 | 0 |
| 0.8347222222222223 | 0 |
| 0.8354166666666667 | 0 |
| 0.8361111111111111 | 0 |
| 0.8368055555555555 | 0 |
| 0.8375 | 0 |
| 0.8381944444444445 | 0 |
| 0.8388888888888889 | 0 |
| 0.8395833333333332 | 0 |
| 0.8402777777777778 | 0 |
| 0.8409722222222222 | 0 |
| 0.8416666666666667 | 0 |
| 0.842361111111111 | 0 |
| 0.8430555555555556 | 0 |
| 0.84375 | 0 |
| 0.8444444444444444 | 0 |
| 0.845138888888889 | 0 |
| 0.8458333333333333 | 0 |
| 0.8465277777777778 | 0 |
| 0.8472222222222222 | 0 |
| 0.8479166666666668 | 0 |
| 0.8486111111111111 | 0 |
| 0.8493055555555555 | 0 |
| 0.85 | 0 |
| 0.8506944444444445 | 0 |
| 0.8513888888888889 | 0 |
| 0.8520833333333333 | 0 |
| 0.8527777777777777 | 0 |
| 0.8534722222222223 | 0 |
| 0.8541666666666666 | 0 |
| 0.8548611111111111 | 0 |
| 0.8555555555555556 | 0 |
| 0.8562500000000001 | 0 |
| 0.8569444444444444 | 0 |
| 0.8576388888888888 | 0 |
| 0.8583333333333334 | 0 |
| 0.8590277777777778 | 0 |
| 0.8597222222222222 | 0 |
| 0.8604166666666666 | 0 |
| 0.8611111111111112 | 0 |
| 0.8618055555555556 | 0 |
| 0.8624999999999999 | 0 |
| 0.8631944444444444 | 0 |
| 0.8638888888888889 | 0 |
| 0.8645833333333334 | 0 |
| 0.8652777777777777 | 0 |
| 0.8659722222222223 | 0 |
| 0.8666666666666667 | 0 |
| 0.8673611111111111 | 0 |
| 0.8680555555555555 | 0 |
| 0.86875 | 0 |
| 0.8694444444444445 | 0 |
| 0.8701388888888889 | 0 |
| 0.8708333333333332 | 0 |
| 0.8715277777777778 | 0 |
| 0.8722222222222222 | 0 |
| 0.8729166666666667 | 0 |
| 0.873611111111111 | 0 |
| 0.8743055555555556 | 0 |
| 0.875 | 0 |
| 0.8756944444444444 | 0 |
| 0.876388888888889 | 0 |
| 0.8770833333333333 | 0 |
| 0.8777777777777778 | 0 |
| 0.8784722222222222 | 0 |
| 0.8791666666666668 | 0 |
| 0.8798611111111111 | 0 |
| 0.8805555555555555 | 0 |
| 0.88125 | 0 |
| 0.8819444444444445 | 0 |
| 0.8826388888888889 | 0 |
| 0.8833333333333333 | 0 |
| 0.8840277777777777 | 0 |
| 0.8847222222222223 | 0 |
| 0.8854166666666666 | 0 |
| 0.8861111111111111 | 0 |
| 0.8868055555555556 | 0 |
| 0.8875000000000001 | 0 |
| 0.8881944444444444 | 0 |
| 0.8888888888888888 | 0 |
| 0.8895833333333334 | 0 |
| 0.8902777777777778 | 0 |
| 0.8909722222222222 | 0 |
| 0.8916666666666666 | 0 |
| 0.8923611111111112 | 0 |
| 0.8930555555555556 | 0 |
| 0.8937499999999999 | 0 |
| 0.8944444444444444 | 0 |
| 0.8951388888888889 | 0 |
| 0.8958333333333334 | 0 |
| 0.8965277777777777 | 0 |
| 0.8972222222222223 | 0 |
| 0.8979166666666667 | 0 |
| 0.8986111111111111 | 0 |
| 0.8993055555555555 | 0 |
| 0.9 | 0 |
| 0.9006944444444445 | 0 |
| 0.9013888888888889 | 0 |
| 0.9020833333333332 | 0 |
| 0.9027777777777778 | 0 |
| 0.9034722222222222 | 0 |
| 0.9041666666666667 | 0 |
| 0.904861111111111 | 0 |
| 0.9055555555555556 | 0 |
| 0.90625 | 0 |
| 0.9069444444444444 | 0 |
| 0.907638888888889 | 0 |
| 0.9083333333333333 | 0 |
| 0.9090277777777778 | 0 |
| 0.9097222222222222 | 0 |
| 0.9104166666666668 | 0 |
| 0.9111111111111111 | 0 |
| 0.9118055555555555 | 0 |
| 0.9125 | 0 |
| 0.9131944444444445 | 0 |
| 0.9138888888888889 | 0 |
| 0.9145833333333333 | 0 |
| 0.9152777777777777 | 0 |
| 0.9159722222222223 | 0 |
| 0.9166666666666666 | 0 |
| 0.9173611111111111 | 0 |
| 0.9180555555555556 | 0 |
| 0.9187500000000001 | 0 |
| 0.9194444444444444 | 0 |
| 0.9201388888888888 | 0 |
| 0.9208333333333334 | 0 |
| 0.9215277777777778 | 0 |
| 0.9222222222222222 | 0 |
| 0.9229166666666666 | 0 |
| 0.9236111111111112 | 0 |
| 0.9243055555555556 | 0 |
| 0.9249999999999999 | 0 |
| 0.9256944444444444 | 0 |
| 0.9263888888888889 | 0 |
| 0.9270833333333334 | 0 |
| 0.9277777777777777 | 0 |
| 0.9284722222222223 | 0 |
| 0.9291666666666667 | 0 |
| 0.9298611111111111 | 0 |
| 0.9305555555555555 | 0 |
| 0.93125 | 0 |
| 0.9319444444444445 | 0 |
| 0.9326388888888889 | 0 |
| 0.9333333333333332 | 0 |
| 0.9340277777777778 | 0 |
| 0.9347222222222222 | 0 |
| 0.9354166666666667 | 0 |
| 0.936111111111111 | 0 |
| 0.9368055555555556 | 0 |
| 0.9375 | 0 |
| 0.9381944444444444 | 0 |
| 0.938888888888889 | 0 |
| 0.9395833333333333 | 0 |
| 0.9402777777777778 | 0 |
| 0.9409722222222222 | 0 |
| 0.9416666666666668 | 0 |
| 0.9423611111111111 | 0 |
| 0.9430555555555555 | 0 |
| 0.94375 | 0 |
| 0.9444444444444445 | 0 |
| 0.9451388888888889 | 0 |
| 0.9458333333333333 | 0 |
| 0.9465277777777777 | 0 |
| 0.9472222222222223 | 0 |
| 0.9479166666666666 | 0 |
| 0.9486111111111111 | 0 |
| 0.9493055555555556 | 0 |
| 0.9500000000000001 | 0 |
| 0.9506944444444444 | 0 |
| 0.9513888888888888 | 0 |
| 0.9520833333333334 | 0 |
| 0.9527777777777778 | 0 |
| 0.9534722222222222 | 0 |
| 0.9541666666666666 | 0 |
| 0.9548611111111112 | 0 |
| 0.9555555555555556 | 0 |
| 0.9562499999999999 | 0 |
| 0.9569444444444444 | 0 |
| 0.9576388888888889 | 0 |
| 0.9583333333333334 | 0 |
| 0.9590277777777777 | 0 |
| 0.9597222222222223 | 0 |
| 0.9604166666666667 | 0 |
| 0.9611111111111111 | 0 |
| 0.9618055555555555 | 0 |
| 0.9625 | 0 |
| 0.9631944444444445 | 0 |
| 0.9638888888888889 | 0 |
| 0.9645833333333332 | 0 |
| 0.9652777777777778 | 0 |
| 0.9659722222222222 | 0 |
| 0.9666666666666667 | 0 |
| 0.967361111111111 | 0 |
| 0.9680555555555556 | 0 |
| 0.96875 | 0 |
| 0.9694444444444444 | 0 |
| 0.970138888888889 | 0 |
| 0.9708333333333333 | 0 |
| 0.9715277777777778 | 0 |
| 0.9722222222222222 | 0 |
| 0.9729166666666668 | 0 |
| 0.9736111111111111 | 0 |
| 0.9743055555555555 | 0 |
| 0.975 | 0 |
| 0.9756944444444445 | 0 |
| 0.9763888888888889 | 0 |
| 0.9770833333333333 | 0 |
| 0.9777777777777777 | 0 |
| 0.9784722222222223 | 0 |
| 0.9791666666666666 | 0 |
| 0.9798611111111111 | 0 |
| 0.9805555555555556 | 0 |
| 0.9812500000000001 | 0 |
| 0.9819444444444444 | 0 |
| 0.9826388888888888 | 0 |
| 0.9833333333333334 | 0 |
| 0.9840277777777778 | 0 |
| 0.9847222222222222 | 0 |
| 0.9854166666666666 | 0 |
| 0.9861111111111112 | 0 |
| 0.9868055555555556 | 0 |
| 0.9874999999999999 | 0 |
| 0.9881944444444444 | 0 |
| 0.9888888888888889 | 0 |
| 0.9895833333333334 | 0 |
| 0.9902777777777777 | 0 |
| 0.9909722222222223 | 0 |
| 0.9916666666666667 | 0 |
| 0.9923611111111111 | 0 |
| 0.9930555555555555 | 0 |
| 0.99375 | 0 |
| 0.9944444444444445 | 0 |
| 0.9951388888888889 | 0 |
| 0.9958333333333332 | 0 |
| 0.9965277777777778 | 0 |
| 0.9972222222222222 | 0 |
| 0.9979166666666667 | 0 |
| 0.998611111111111 | 0 |
| 0.9993055555555556 | 0 |